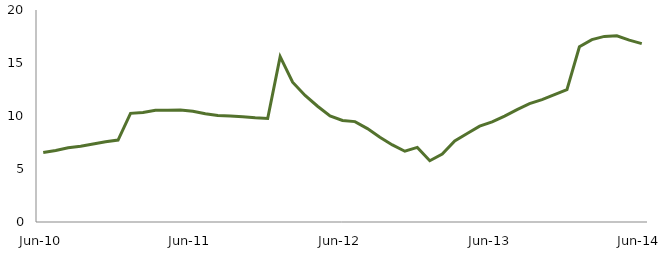
| Category | Series 0 |
|---|---|
| Jun-10 | 6.554 |
|  | 6.752 |
|  | 6.999 |
|  | 7.146 |
|  | 7.351 |
|  | 7.58 |
|  | 7.73 |
|  | 10.248 |
|  | 10.324 |
|  | 10.533 |
|  | 10.537 |
|  | 10.57 |
| Jun-11 | 10.452 |
|  | 10.207 |
|  | 10.049 |
|  | 10.007 |
|  | 9.921 |
|  | 9.825 |
|  | 9.769 |
|  | 15.6 |
|  | 13.183 |
|  | 11.939 |
|  | 10.922 |
|  | 10 |
| Jun-12 | 9.58 |
|  | 9.469 |
|  | 8.808 |
|  | 7.988 |
|  | 7.268 |
|  | 6.674 |
|  | 7.037 |
|  | 5.783 |
|  | 6.416 |
|  | 7.652 |
|  | 8.343 |
|  | 9.038 |
| Jun-13 | 9.444 |
|  | 9.997 |
|  | 10.606 |
|  | 11.164 |
|  | 11.55 |
|  | 12.014 |
|  | 12.486 |
|  | 16.529 |
|  | 17.207 |
|  | 17.508 |
|  | 17.569 |
|  | 17.163 |
| Jun-14 | 16.827 |